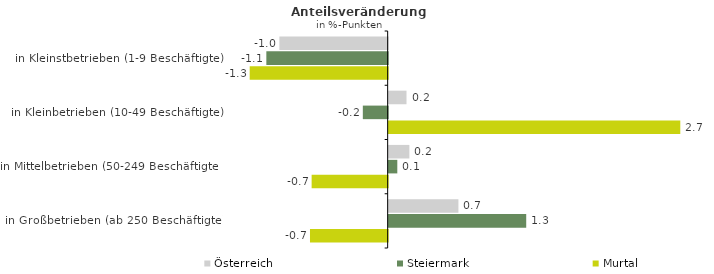
| Category | Österreich | Steiermark | Murtal |
|---|---|---|---|
| in Kleinstbetrieben (1-9 Beschäftigte) | -1.011 | -1.133 | -1.288 |
| in Kleinbetrieben (10-49 Beschäftigte) | 0.167 | -0.232 | 2.723 |
| in Mittelbetrieben (50-249 Beschäftigte) | 0.193 | 0.081 | -0.71 |
| in Großbetrieben (ab 250 Beschäftigte) | 0.651 | 1.284 | -0.725 |